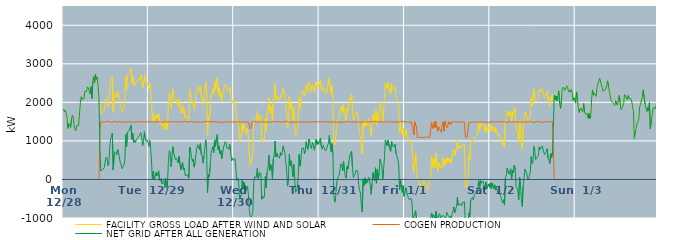
| Category | FACILITY GROSS LOAD AFTER WIND AND SOLAR | COGEN PRODUCTION | NET GRID AFTER ALL GENERATION |
|---|---|---|---|
|  Mon  12/28 | 1824 | 0 | 1824 |
|  Mon  12/28 | 1762 | 0 | 1762 |
|  Mon  12/28 | 1803 | 0 | 1803 |
|  Mon  12/28 | 1714 | 0 | 1714 |
|  Mon  12/28 | 1609 | 0 | 1609 |
|  Mon  12/28 | 1324 | 0 | 1324 |
|  Mon  12/28 | 1448 | 0 | 1448 |
|  Mon  12/28 | 1418 | 0 | 1418 |
|  Mon  12/28 | 1351 | 0 | 1351 |
|  Mon  12/28 | 1542 | 0 | 1542 |
|  Mon  12/28 | 1669 | 0 | 1669 |
|  Mon  12/28 | 1625 | 0 | 1625 |
|  Mon  12/28 | 1381 | 0 | 1381 |
|  Mon  12/28 | 1300 | 0 | 1300 |
|  Mon  12/28 | 1261 | 0 | 1261 |
|  Mon  12/28 | 1401 | 0 | 1401 |
|  Mon  12/28 | 1407 | 0 | 1407 |
|  Mon  12/28 | 1395 | 0 | 1395 |
|  Mon  12/28 | 1663 | 0 | 1663 |
|  Mon  12/28 | 1982 | 0 | 1982 |
|  Mon  12/28 | 2145 | 0 | 2145 |
|  Mon  12/28 | 2077 | 0 | 2077 |
|  Mon  12/28 | 2067 | 0 | 2067 |
|  Mon  12/28 | 2094 | 0 | 2094 |
|  Mon  12/28 | 2285 | 0 | 2285 |
|  Mon  12/28 | 2299 | 0 | 2299 |
|  Mon  12/28 | 2285 | 0 | 2285 |
|  Mon  12/28 | 2402 | 0 | 2402 |
|  Mon  12/28 | 2374 | 0 | 2374 |
|  Mon  12/28 | 2353 | 0 | 2353 |
|  Mon  12/28 | 2224 | 0 | 2224 |
|  Mon  12/28 | 2405 | 0 | 2405 |
|  Mon  12/28 | 2101 | 0 | 2101 |
|  Mon  12/28 | 2532 | 0 | 2532 |
|  Mon  12/28 | 2665 | 0 | 2665 |
|  Mon  12/28 | 2505 | 0 | 2505 |
|  Mon  12/28 | 2722 | 0 | 2722 |
|  Mon  12/28 | 2598 | 0 | 2598 |
|  Mon  12/28 | 2647 | 0 | 2647 |
|  Mon  12/28 | 2416 | 0 | 2416 |
|  Mon  12/28 | 2116 | 0 | 2116 |
|  Mon  12/28 | 2050 | 1239 | 811 |
|  Mon  12/28 | 1715 | 1495 | 220 |
|  Mon  12/28 | 1727 | 1495 | 232 |
|  Mon  12/28 | 1740 | 1489 | 251 |
|  Mon  12/28 | 1734 | 1494 | 240 |
|  Mon  12/28 | 1800 | 1488 | 312 |
|  Mon  12/28 | 1966 | 1487 | 479 |
|  Mon  12/28 | 2085 | 1500 | 585 |
|  Mon  12/28 | 2033 | 1498 | 535 |
|  Mon  12/28 | 1870 | 1507 | 363 |
|  Mon  12/28 | 1921 | 1501 | 420 |
|  Mon  12/28 | 2278 | 1493 | 785 |
|  Mon  12/28 | 2534 | 1489 | 1045 |
|  Mon  12/28 | 2602 | 1478 | 1124 |
|  Mon  12/28 | 2685 | 1486 | 1199 |
|  Mon  12/28 | 1736 | 1488 | 248 |
|  Mon  12/28 | 2131 | 1494 | 637 |
|  Mon  12/28 | 2230 | 1510 | 720 |
|  Mon  12/28 | 2182 | 1494 | 688 |
|  Mon  12/28 | 2119 | 1479 | 640 |
|  Mon  12/28 | 2277 | 1499 | 778 |
|  Mon  12/28 | 2191 | 1500 | 691 |
|  Mon  12/28 | 2165 | 1493 | 672 |
|  Mon  12/28 | 1934 | 1501 | 433 |
|  Mon  12/28 | 1851 | 1489 | 362 |
|  Mon  12/28 | 1764 | 1485 | 279 |
|  Mon  12/28 | 1799 | 1503 | 296 |
|  Mon  12/28 | 1867 | 1490 | 377 |
|  Mon  12/28 | 1979 | 1491 | 488 |
|  Mon  12/28 | 2654 | 1489 | 1165 |
|  Mon  12/28 | 2328 | 1479 | 849 |
|  Mon  12/28 | 2715 | 1493 | 1222 |
|  Mon  12/28 | 2695 | 1490 | 1205 |
|  Mon  12/28 | 2775 | 1498 | 1277 |
|  Mon  12/28 | 2755 | 1490 | 1265 |
|  Mon  12/28 | 2893 | 1487 | 1406 |
|  Mon  12/28 | 2520 | 1480 | 1040 |
|  Mon  12/28 | 2679 | 1482 | 1197 |
|  Mon  12/28 | 2454 | 1497 | 957 |
|  Mon  12/28 | 2513 | 1491 | 1022 |
|  Mon  12/28 | 2446 | 1485 | 961 |
|  Mon  12/28 | 2547 | 1499 | 1048 |
|  Mon  12/28 | 2536 | 1507 | 1029 |
|  Mon  12/28 | 2585 | 1494 | 1091 |
|  Mon  12/28 | 2631 | 1504 | 1127 |
|  Mon  12/28 | 2602 | 1493 | 1109 |
|  Mon  12/28 | 2717 | 1505 | 1212 |
|  Mon  12/28 | 2593 | 1493 | 1100 |
|  Mon  12/28 | 2373 | 1496 | 877 |
|  Mon  12/28 | 2469 | 1492 | 977 |
|  Mon  12/28 | 2725 | 1484 | 1241 |
|  Mon  12/28 | 2548 | 1491 | 1057 |
|  Mon  12/28 | 2485 | 1496 | 989 |
|  Mon  12/28 | 2523 | 1493 | 1030 |
|  Mon  12/28 | 2456 | 1494 | 962 |
|  Tue  12/29 | 2356 | 1495 | 861 |
|  Tue  12/29 | 2505 | 1492 | 1013 |
|  Tue  12/29 | 2301 | 1495 | 806 |
|  Tue  12/29 | 2008 | 1502 | 506 |
|  Tue  12/29 | 1506 | 1499 | 7 |
|  Tue  12/29 | 1715 | 1505 | 210 |
|  Tue  12/29 | 1493 | 1490 | 3 |
|  Tue  12/29 | 1558 | 1493 | 65 |
|  Tue  12/29 | 1677 | 1495 | 182 |
|  Tue  12/29 | 1588 | 1496 | 92 |
|  Tue  12/29 | 1648 | 1503 | 145 |
|  Tue  12/29 | 1710 | 1485 | 225 |
|  Tue  12/29 | 1479 | 1490 | -11 |
|  Tue  12/29 | 1442 | 1485 | -43 |
|  Tue  12/29 | 1508 | 1486 | 22 |
|  Tue  12/29 | 1374 | 1488 | -114 |
|  Tue  12/29 | 1354 | 1487 | -133 |
|  Tue  12/29 | 1459 | 1485 | -26 |
|  Tue  12/29 | 1287 | 1492 | -205 |
|  Tue  12/29 | 1514 | 1490 | 24 |
|  Tue  12/29 | 1281 | 1498 | -217 |
|  Tue  12/29 | 1376 | 1497 | -121 |
|  Tue  12/29 | 1939 | 1489 | 450 |
|  Tue  12/29 | 2246 | 1499 | 747 |
|  Tue  12/29 | 2210 | 1500 | 710 |
|  Tue  12/29 | 1829 | 1496 | 333 |
|  Tue  12/29 | 2035 | 1490 | 545 |
|  Tue  12/29 | 2351 | 1499 | 852 |
|  Tue  12/29 | 2173 | 1497 | 676 |
|  Tue  12/29 | 2094 | 1488 | 606 |
|  Tue  12/29 | 2009 | 1496 | 513 |
|  Tue  12/29 | 2058 | 1502 | 556 |
|  Tue  12/29 | 2063 | 1489 | 574 |
|  Tue  12/29 | 1918 | 1486 | 432 |
|  Tue  12/29 | 2093 | 1493 | 600 |
|  Tue  12/29 | 2107 | 1493 | 614 |
|  Tue  12/29 | 1749 | 1496 | 253 |
|  Tue  12/29 | 1714 | 1486 | 228 |
|  Tue  12/29 | 1926 | 1492 | 434 |
|  Tue  12/29 | 1734 | 1490 | 244 |
|  Tue  12/29 | 1799 | 1502 | 297 |
|  Tue  12/29 | 1593 | 1493 | 100 |
|  Tue  12/29 | 1584 | 1498 | 86 |
|  Tue  12/29 | 1616 | 1492 | 124 |
|  Tue  12/29 | 1561 | 1481 | 80 |
|  Tue  12/29 | 1531 | 1498 | 33 |
|  Tue  12/29 | 2338 | 1501 | 837 |
|  Tue  12/29 | 2234 | 1480 | 754 |
|  Tue  12/29 | 2085 | 1500 | 585 |
|  Tue  12/29 | 1968 | 1502 | 466 |
|  Tue  12/29 | 2018 | 1486 | 532 |
|  Tue  12/29 | 1810 | 1489 | 321 |
|  Tue  12/29 | 1917 | 1490 | 427 |
|  Tue  12/29 | 2161 | 1498 | 663 |
|  Tue  12/29 | 2298 | 1486 | 812 |
|  Tue  12/29 | 2401 | 1501 | 900 |
|  Tue  12/29 | 2377 | 1494 | 883 |
|  Tue  12/29 | 2275 | 1501 | 774 |
|  Tue  12/29 | 2412 | 1484 | 928 |
|  Tue  12/29 | 2162 | 1503 | 659 |
|  Tue  12/29 | 2090 | 1485 | 605 |
|  Tue  12/29 | 1931 | 1507 | 424 |
|  Tue  12/29 | 2103 | 1497 | 606 |
|  Tue  12/29 | 2289 | 1476 | 813 |
|  Tue  12/29 | 2526 | 1500 | 1026 |
|  Tue  12/29 | 2268 | 1495 | 773 |
|  Tue  12/29 | 1152 | 1500 | -348 |
|  Tue  12/29 | 1625 | 1495 | 130 |
|  Tue  12/29 | 1563 | 1497 | 66 |
|  Tue  12/29 | 1801 | 1476 | 325 |
|  Tue  12/29 | 2179 | 1504 | 675 |
|  Tue  12/29 | 2251 | 1481 | 770 |
|  Tue  12/29 | 2345 | 1497 | 848 |
|  Tue  12/29 | 2207 | 1509 | 698 |
|  Tue  12/29 | 2517 | 1496 | 1021 |
|  Tue  12/29 | 2340 | 1494 | 846 |
|  Tue  12/29 | 2561 | 1492 | 1069 |
|  Tue  12/29 | 2656 | 1490 | 1166 |
|  Tue  12/29 | 2255 | 1489 | 766 |
|  Tue  12/29 | 2367 | 1497 | 870 |
|  Tue  12/29 | 2151 | 1486 | 665 |
|  Tue  12/29 | 2259 | 1496 | 763 |
|  Tue  12/29 | 2024 | 1481 | 543 |
|  Tue  12/29 | 2193 | 1492 | 701 |
|  Tue  12/29 | 2289 | 1477 | 812 |
|  Tue  12/29 | 2422 | 1501 | 921 |
|  Tue  12/29 | 2477 | 1498 | 979 |
|  Tue  12/29 | 2416 | 1491 | 925 |
|  Tue  12/29 | 2311 | 1501 | 810 |
|  Tue  12/29 | 2306 | 1485 | 821 |
|  Tue  12/29 | 2271 | 1484 | 787 |
|  Tue  12/29 | 2396 | 1486 | 910 |
|  Tue  12/29 | 2215 | 1494 | 721 |
|  Tue  12/29 | 1995 | 1508 | 487 |
|  Tue  12/29 | 2048 | 1489 | 559 |
|  Tue  12/29 | 1980 | 1483 | 497 |
|  Wed  12/30 | 1994 | 1497 | 497 |
|  Wed  12/30 | 2037 | 1496 | 541 |
|  Wed  12/30 | 1736 | 1487 | 249 |
|  Wed  12/30 | 1461 | 1488 | -27 |
|  Wed  12/30 | 1525 | 1494 | 31 |
|  Wed  12/30 | 1466 | 1509 | -43 |
|  Wed  12/30 | 993 | 1493 | -500 |
|  Wed  12/30 | 995 | 1485 | -490 |
|  Wed  12/30 | 1085 | 1487 | -402 |
|  Wed  12/30 | 1493 | 1492 | 1 |
|  Wed  12/30 | 1255 | 1491 | -236 |
|  Wed  12/30 | 1422 | 1489 | -67 |
|  Wed  12/30 | 1316 | 1495 | -179 |
|  Wed  12/30 | 1186 | 1496 | -310 |
|  Wed  12/30 | 1287 | 1490 | -203 |
|  Wed  12/30 | 1325 | 1494 | -169 |
|  Wed  12/30 | 1093 | 1488 | -395 |
|  Wed  12/30 | 703 | 1491 | -788 |
|  Wed  12/30 | 365 | 1310 | -945 |
|  Wed  12/30 | 368 | 1342 | -974 |
|  Wed  12/30 | 557 | 1491 | -934 |
|  Wed  12/30 | 660 | 1494 | -834 |
|  Wed  12/30 | 1425 | 1505 | -80 |
|  Wed  12/30 | 1559 | 1489 | 70 |
|  Wed  12/30 | 1569 | 1494 | 75 |
|  Wed  12/30 | 1563 | 1502 | 61 |
|  Wed  12/30 | 1773 | 1486 | 287 |
|  Wed  12/30 | 1519 | 1490 | 29 |
|  Wed  12/30 | 1618 | 1496 | 122 |
|  Wed  12/30 | 1672 | 1490 | 182 |
|  Wed  12/30 | 1639 | 1486 | 153 |
|  Wed  12/30 | 978 | 1493 | -515 |
|  Wed  12/30 | 1070 | 1497 | -427 |
|  Wed  12/30 | 1005 | 1490 | -485 |
|  Wed  12/30 | 1061 | 1494 | -433 |
|  Wed  12/30 | 1577 | 1503 | 74 |
|  Wed  12/30 | 1274 | 1487 | -213 |
|  Wed  12/30 | 1689 | 1497 | 192 |
|  Wed  12/30 | 1777 | 1478 | 299 |
|  Wed  12/30 | 2120 | 1490 | 630 |
|  Wed  12/30 | 1730 | 1496 | 234 |
|  Wed  12/30 | 1887 | 1501 | 386 |
|  Wed  12/30 | 1795 | 1488 | 307 |
|  Wed  12/30 | 1484 | 1483 | 1 |
|  Wed  12/30 | 2040 | 1502 | 538 |
|  Wed  12/30 | 2131 | 1493 | 638 |
|  Wed  12/30 | 2499 | 1504 | 995 |
|  Wed  12/30 | 2073 | 1491 | 582 |
|  Wed  12/30 | 2165 | 1486 | 679 |
|  Wed  12/30 | 2093 | 1492 | 601 |
|  Wed  12/30 | 2109 | 1499 | 610 |
|  Wed  12/30 | 2041 | 1491 | 550 |
|  Wed  12/30 | 2185 | 1488 | 697 |
|  Wed  12/30 | 2122 | 1502 | 620 |
|  Wed  12/30 | 2196 | 1493 | 703 |
|  Wed  12/30 | 2363 | 1496 | 867 |
|  Wed  12/30 | 2266 | 1490 | 776 |
|  Wed  12/30 | 2186 | 1489 | 697 |
|  Wed  12/30 | 1942 | 1503 | 439 |
|  Wed  12/30 | 1737 | 1490 | 247 |
|  Wed  12/30 | 1334 | 1506 | -172 |
|  Wed  12/30 | 1477 | 1475 | 2 |
|  Wed  12/30 | 2153 | 1494 | 659 |
|  Wed  12/30 | 1852 | 1493 | 359 |
|  Wed  12/30 | 1966 | 1482 | 484 |
|  Wed  12/30 | 1783 | 1479 | 304 |
|  Wed  12/30 | 1551 | 1485 | 66 |
|  Wed  12/30 | 1883 | 1492 | 391 |
|  Wed  12/30 | 1524 | 1495 | 29 |
|  Wed  12/30 | 1147 | 1484 | -337 |
|  Wed  12/30 | 1196 | 1507 | -311 |
|  Wed  12/30 | 1273 | 1489 | -216 |
|  Wed  12/30 | 1570 | 1497 | 73 |
|  Wed  12/30 | 2124 | 1475 | 649 |
|  Wed  12/30 | 1836 | 1493 | 343 |
|  Wed  12/30 | 2010 | 1496 | 514 |
|  Wed  12/30 | 2294 | 1485 | 809 |
|  Wed  12/30 | 2292 | 1487 | 805 |
|  Wed  12/30 | 2301 | 1486 | 815 |
|  Wed  12/30 | 2162 | 1499 | 663 |
|  Wed  12/30 | 2246 | 1499 | 747 |
|  Wed  12/30 | 2466 | 1487 | 979 |
|  Wed  12/30 | 2346 | 1502 | 844 |
|  Wed  12/30 | 2268 | 1484 | 784 |
|  Wed  12/30 | 2530 | 1484 | 1046 |
|  Wed  12/30 | 2464 | 1488 | 976 |
|  Wed  12/30 | 2339 | 1493 | 846 |
|  Wed  12/30 | 2285 | 1484 | 801 |
|  Wed  12/30 | 2457 | 1491 | 966 |
|  Wed  12/30 | 2407 | 1492 | 915 |
|  Wed  12/30 | 2259 | 1498 | 761 |
|  Wed  12/30 | 2369 | 1506 | 863 |
|  Wed  12/30 | 2538 | 1495 | 1043 |
|  Wed  12/30 | 2399 | 1492 | 907 |
|  Wed  12/30 | 2472 | 1482 | 990 |
|  Wed  12/30 | 2406 | 1494 | 912 |
|  Thu  12/31 | 2484 | 1490 | 994 |
|  Thu  12/31 | 2574 | 1498 | 1076 |
|  Thu  12/31 | 2350 | 1495 | 855 |
|  Thu  12/31 | 2288 | 1503 | 785 |
|  Thu  12/31 | 2371 | 1486 | 885 |
|  Thu  12/31 | 2397 | 1490 | 907 |
|  Thu  12/31 | 2276 | 1498 | 778 |
|  Thu  12/31 | 2227 | 1489 | 738 |
|  Thu  12/31 | 2276 | 1482 | 794 |
|  Thu  12/31 | 2391 | 1494 | 897 |
|  Thu  12/31 | 2412 | 1487 | 925 |
|  Thu  12/31 | 2635 | 1493 | 1142 |
|  Thu  12/31 | 2397 | 1506 | 891 |
|  Thu  12/31 | 2212 | 1493 | 719 |
|  Thu  12/31 | 2432 | 1502 | 930 |
|  Thu  12/31 | 2164 | 1489 | 675 |
|  Thu  12/31 | 1087 | 1493 | -406 |
|  Thu  12/31 | 901 | 1494 | -593 |
|  Thu  12/31 | 1009 | 1494 | -485 |
|  Thu  12/31 | 1302 | 1485 | -183 |
|  Thu  12/31 | 1512 | 1495 | 17 |
|  Thu  12/31 | 1556 | 1488 | 68 |
|  Thu  12/31 | 1599 | 1487 | 112 |
|  Thu  12/31 | 1747 | 1488 | 259 |
|  Thu  12/31 | 1903 | 1496 | 407 |
|  Thu  12/31 | 1836 | 1484 | 352 |
|  Thu  12/31 | 1725 | 1498 | 227 |
|  Thu  12/31 | 1956 | 1481 | 475 |
|  Thu  12/31 | 1707 | 1494 | 213 |
|  Thu  12/31 | 1603 | 1503 | 100 |
|  Thu  12/31 | 1516 | 1482 | 34 |
|  Thu  12/31 | 1838 | 1502 | 336 |
|  Thu  12/31 | 1778 | 1502 | 276 |
|  Thu  12/31 | 1966 | 1497 | 469 |
|  Thu  12/31 | 2121 | 1504 | 617 |
|  Thu  12/31 | 2086 | 1484 | 602 |
|  Thu  12/31 | 2215 | 1486 | 729 |
|  Thu  12/31 | 1818 | 1489 | 329 |
|  Thu  12/31 | 1545 | 1494 | 51 |
|  Thu  12/31 | 1594 | 1497 | 97 |
|  Thu  12/31 | 1629 | 1492 | 137 |
|  Thu  12/31 | 1713 | 1483 | 230 |
|  Thu  12/31 | 1759 | 1505 | 254 |
|  Thu  12/31 | 1729 | 1507 | 222 |
|  Thu  12/31 | 1357 | 1487 | -130 |
|  Thu  12/31 | 1195 | 1480 | -285 |
|  Thu  12/31 | 1136 | 1486 | -350 |
|  Thu  12/31 | 831 | 1486 | -655 |
|  Thu  12/31 | 658 | 1501 | -843 |
|  Thu  12/31 | 1465 | 1481 | -16 |
|  Thu  12/31 | 1351 | 1512 | -161 |
|  Thu  12/31 | 1536 | 1494 | 42 |
|  Thu  12/31 | 1378 | 1489 | -111 |
|  Thu  12/31 | 1476 | 1490 | -14 |
|  Thu  12/31 | 1418 | 1492 | -74 |
|  Thu  12/31 | 1573 | 1510 | 63 |
|  Thu  12/31 | 1500 | 1495 | 5 |
|  Thu  12/31 | 1353 | 1507 | -154 |
|  Thu  12/31 | 1120 | 1504 | -384 |
|  Thu  12/31 | 1377 | 1502 | -125 |
|  Thu  12/31 | 1669 | 1490 | 179 |
|  Thu  12/31 | 1542 | 1505 | 37 |
|  Thu  12/31 | 1479 | 1508 | -29 |
|  Thu  12/31 | 1796 | 1493 | 303 |
|  Thu  12/31 | 1407 | 1505 | -98 |
|  Thu  12/31 | 1762 | 1493 | 269 |
|  Thu  12/31 | 1499 | 1493 | 6 |
|  Thu  12/31 | 1671 | 1498 | 173 |
|  Thu  12/31 | 2024 | 1501 | 523 |
|  Thu  12/31 | 1923 | 1494 | 429 |
|  Thu  12/31 | 1861 | 1487 | 374 |
|  Thu  12/31 | 1488 | 1500 | -12 |
|  Thu  12/31 | 1749 | 1488 | 261 |
|  Thu  12/31 | 2073 | 1514 | 559 |
|  Thu  12/31 | 2512 | 1496 | 1016 |
|  Thu  12/31 | 2430 | 1480 | 950 |
|  Thu  12/31 | 2370 | 1500 | 870 |
|  Thu  12/31 | 2515 | 1501 | 1014 |
|  Thu  12/31 | 2512 | 1500 | 1012 |
|  Thu  12/31 | 2272 | 1484 | 788 |
|  Thu  12/31 | 2208 | 1478 | 730 |
|  Thu  12/31 | 2487 | 1502 | 985 |
|  Thu  12/31 | 2368 | 1495 | 873 |
|  Thu  12/31 | 2337 | 1488 | 849 |
|  Thu  12/31 | 2334 | 1487 | 847 |
|  Thu  12/31 | 2404 | 1489 | 915 |
|  Thu  12/31 | 2167 | 1502 | 665 |
|  Thu  12/31 | 2110 | 1492 | 618 |
|  Thu  12/31 | 2010 | 1494 | 516 |
|  Thu  12/31 | 1875 | 1490 | 385 |
|  Thu  12/31 | 1221 | 1489 | -268 |
|  Thu  12/31 | 1505 | 1500 | 5 |
|  Thu  12/31 | 1272 | 1480 | -208 |
|  Thu  12/31 | 1164 | 1499 | -335 |
|  Thu  12/31 | 1326 | 1485 | -159 |
|  Thu  12/31 | 1065 | 1503 | -438 |
|  Fri  1/1 | 1140 | 1498 | -358 |
|  Fri  1/1 | 1283 | 1495 | -212 |
|  Fri  1/1 | 1177 | 1499 | -322 |
|  Fri  1/1 | 1073 | 1485 | -412 |
|  Fri  1/1 | 1012 | 1492 | -480 |
|  Fri  1/1 | 967 | 1491 | -524 |
|  Fri  1/1 | 957 | 1489 | -532 |
|  Fri  1/1 | 1009 | 1499 | -490 |
|  Fri  1/1 | 890 | 1500 | -610 |
|  Fri  1/1 | 275 | 1332 | -1057 |
|  Fri  1/1 | 184 | 1163 | -979 |
|  Fri  1/1 | 516 | 1497 | -981 |
|  Fri  1/1 | 675 | 1487 | -812 |
|  Fri  1/1 | 343 | 1365 | -1022 |
|  Fri  1/1 | -12 | 1090 | -1102 |
|  Fri  1/1 | -46 | 1097 | -1143 |
|  Fri  1/1 | -69 | 1091 | -1160 |
|  Fri  1/1 | -51 | 1091 | -1142 |
|  Fri  1/1 | -237 | 1092 | -1329 |
|  Fri  1/1 | -246 | 1101 | -1347 |
|  Fri  1/1 | -139 | 1090 | -1229 |
|  Fri  1/1 | -32 | 1092 | -1124 |
|  Fri  1/1 | -107 | 1091 | -1198 |
|  Fri  1/1 | -125 | 1095 | -1220 |
|  Fri  1/1 | -109 | 1100 | -1209 |
|  Fri  1/1 | -275 | 1098 | -1373 |
|  Fri  1/1 | -214 | 1100 | -1314 |
|  Fri  1/1 | -152 | 1094 | -1246 |
|  Fri  1/1 | 13 | 1091 | -1078 |
|  Fri  1/1 | 114 | 1105 | -991 |
|  Fri  1/1 | 616 | 1485 | -869 |
|  Fri  1/1 | 310 | 1315 | -1005 |
|  Fri  1/1 | 446 | 1360 | -914 |
|  Fri  1/1 | 550 | 1496 | -946 |
|  Fri  1/1 | 309 | 1342 | -1033 |
|  Fri  1/1 | 680 | 1501 | -821 |
|  Fri  1/1 | 334 | 1338 | -1004 |
|  Fri  1/1 | 204 | 1251 | -1047 |
|  Fri  1/1 | 442 | 1367 | -925 |
|  Fri  1/1 | 434 | 1319 | -885 |
|  Fri  1/1 | 313 | 1314 | -1001 |
|  Fri  1/1 | 285 | 1225 | -940 |
|  Fri  1/1 | 454 | 1425 | -971 |
|  Fri  1/1 | 560 | 1493 | -933 |
|  Fri  1/1 | 336 | 1253 | -917 |
|  Fri  1/1 | 526 | 1508 | -982 |
|  Fri  1/1 | 394 | 1405 | -1011 |
|  Fri  1/1 | 566 | 1421 | -855 |
|  Fri  1/1 | 463 | 1333 | -870 |
|  Fri  1/1 | 548 | 1498 | -950 |
|  Fri  1/1 | 448 | 1439 | -991 |
|  Fri  1/1 | 536 | 1487 | -951 |
|  Fri  1/1 | 423 | 1421 | -998 |
|  Fri  1/1 | 603 | 1494 | -891 |
|  Fri  1/1 | 675 | 1503 | -828 |
|  Fri  1/1 | 784 | 1497 | -713 |
|  Fri  1/1 | 620 | 1486 | -866 |
|  Fri  1/1 | 707 | 1489 | -782 |
|  Fri  1/1 | 785 | 1489 | -704 |
|  Fri  1/1 | 1022 | 1485 | -463 |
|  Fri  1/1 | 801 | 1479 | -678 |
|  Fri  1/1 | 833 | 1490 | -657 |
|  Fri  1/1 | 867 | 1494 | -627 |
|  Fri  1/1 | 861 | 1485 | -624 |
|  Fri  1/1 | 797 | 1483 | -686 |
|  Fri  1/1 | 912 | 1495 | -583 |
|  Fri  1/1 | 896 | 1507 | -611 |
|  Fri  1/1 | 905 | 1482 | -577 |
|  Fri  1/1 | -193 | 1092 | -1285 |
|  Fri  1/1 | -228 | 1103 | -1331 |
|  Fri  1/1 | -249 | 1098 | -1347 |
|  Fri  1/1 | -45 | 1087 | -1132 |
|  Fri  1/1 | 622 | 1488 | -866 |
|  Fri  1/1 | 514 | 1487 | -973 |
|  Fri  1/1 | 964 | 1483 | -519 |
|  Fri  1/1 | 987 | 1504 | -517 |
|  Fri  1/1 | 1024 | 1494 | -470 |
|  Fri  1/1 | 959 | 1491 | -532 |
|  Fri  1/1 | 1077 | 1485 | -408 |
|  Fri  1/1 | 1127 | 1497 | -370 |
|  Fri  1/1 | 1148 | 1497 | -349 |
|  Fri  1/1 | 1136 | 1485 | -349 |
|  Fri  1/1 | 1264 | 1475 | -211 |
|  Fri  1/1 | 1460 | 1491 | -31 |
|  Fri  1/1 | 1249 | 1493 | -244 |
|  Fri  1/1 | 1462 | 1489 | -27 |
|  Fri  1/1 | 1407 | 1497 | -90 |
|  Fri  1/1 | 1396 | 1489 | -93 |
|  Fri  1/1 | 1432 | 1481 | -49 |
|  Fri  1/1 | 1333 | 1489 | -156 |
|  Fri  1/1 | 1221 | 1493 | -272 |
|  Fri  1/1 | 1436 | 1502 | -66 |
|  Fri  1/1 | 1250 | 1487 | -237 |
|  Fri  1/1 | 1231 | 1482 | -251 |
|  Fri  1/1 | 1356 | 1477 | -121 |
|  Fri  1/1 | 1297 | 1498 | -201 |
|  Sat  1/2 | 1403 | 1494 | -91 |
|  Sat  1/2 | 1260 | 1494 | -234 |
|  Sat  1/2 | 1406 | 1495 | -89 |
|  Sat  1/2 | 1390 | 1497 | -107 |
|  Sat  1/2 | 1246 | 1491 | -245 |
|  Sat  1/2 | 1347 | 1485 | -138 |
|  Sat  1/2 | 1222 | 1500 | -278 |
|  Sat  1/2 | 1288 | 1495 | -207 |
|  Sat  1/2 | 1292 | 1497 | -205 |
|  Sat  1/2 | 1120 | 1495 | -375 |
|  Sat  1/2 | 1181 | 1497 | -316 |
|  Sat  1/2 | 1188 | 1496 | -308 |
|  Sat  1/2 | 1036 | 1493 | -457 |
|  Sat  1/2 | 933 | 1491 | -558 |
|  Sat  1/2 | 890 | 1492 | -602 |
|  Sat  1/2 | 978 | 1503 | -525 |
|  Sat  1/2 | 828 | 1493 | -665 |
|  Sat  1/2 | 1531 | 1497 | 34 |
|  Sat  1/2 | 1599 | 1485 | 114 |
|  Sat  1/2 | 1781 | 1486 | 295 |
|  Sat  1/2 | 1765 | 1487 | 278 |
|  Sat  1/2 | 1637 | 1497 | 140 |
|  Sat  1/2 | 1712 | 1517 | 195 |
|  Sat  1/2 | 1779 | 1504 | 275 |
|  Sat  1/2 | 1498 | 1482 | 16 |
|  Sat  1/2 | 1733 | 1500 | 233 |
|  Sat  1/2 | 1668 | 1493 | 175 |
|  Sat  1/2 | 1858 | 1492 | 366 |
|  Sat  1/2 | 1784 | 1499 | 285 |
|  Sat  1/2 | 1316 | 1490 | -174 |
|  Sat  1/2 | 1270 | 1490 | -220 |
|  Sat  1/2 | 1189 | 1501 | -312 |
|  Sat  1/2 | 960 | 1495 | -535 |
|  Sat  1/2 | 1536 | 1479 | 57 |
|  Sat  1/2 | 1363 | 1490 | -127 |
|  Sat  1/2 | 967 | 1493 | -526 |
|  Sat  1/2 | 791 | 1493 | -702 |
|  Sat  1/2 | 1331 | 1501 | -170 |
|  Sat  1/2 | 1516 | 1483 | 33 |
|  Sat  1/2 | 1764 | 1496 | 268 |
|  Sat  1/2 | 1721 | 1505 | 216 |
|  Sat  1/2 | 1647 | 1498 | 149 |
|  Sat  1/2 | 1518 | 1492 | 26 |
|  Sat  1/2 | 1478 | 1480 | -2 |
|  Sat  1/2 | 1475 | 1500 | -25 |
|  Sat  1/2 | 1688 | 1503 | 185 |
|  Sat  1/2 | 2098 | 1507 | 591 |
|  Sat  1/2 | 1907 | 1497 | 410 |
|  Sat  1/2 | 1931 | 1471 | 460 |
|  Sat  1/2 | 2350 | 1496 | 854 |
|  Sat  1/2 | 2260 | 1491 | 769 |
|  Sat  1/2 | 2008 | 1494 | 514 |
|  Sat  1/2 | 1991 | 1497 | 494 |
|  Sat  1/2 | 2080 | 1488 | 592 |
|  Sat  1/2 | 2125 | 1503 | 622 |
|  Sat  1/2 | 2336 | 1491 | 845 |
|  Sat  1/2 | 2267 | 1498 | 769 |
|  Sat  1/2 | 2270 | 1485 | 785 |
|  Sat  1/2 | 2355 | 1484 | 871 |
|  Sat  1/2 | 2311 | 1494 | 817 |
|  Sat  1/2 | 2317 | 1484 | 833 |
|  Sat  1/2 | 2131 | 1491 | 640 |
|  Sat  1/2 | 2182 | 1499 | 683 |
|  Sat  1/2 | 2211 | 1487 | 724 |
|  Sat  1/2 | 2293 | 1496 | 797 |
|  Sat  1/2 | 2057 | 1500 | 557 |
|  Sat  1/2 | 1992 | 1498 | 494 |
|  Sat  1/2 | 1898 | 1487 | 411 |
|  Sat  1/2 | 2165 | 1492 | 673 |
|  Sat  1/2 | 2057 | 1495 | 562 |
|  Sat  1/2 | 2204 | 1495 | 709 |
|  Sat  1/2 | 2191 | 1494 | 697 |
|  Sat  1/2 | 2186 | 0 | 2186 |
|  Sat  1/2 | 2072 | 0 | 2072 |
|  Sat  1/2 | 2165 | 0 | 2165 |
|  Sat  1/2 | 2036 | 0 | 2036 |
|  Sat  1/2 | 2156 | 0 | 2156 |
|  Sat  1/2 | 2298 | 0 | 2298 |
|  Sat  1/2 | 1974 | 0 | 1974 |
|  Sat  1/2 | 1840 | 0 | 1840 |
|  Sat  1/2 | 2031 | 0 | 2031 |
|  Sat  1/2 | 2363 | 0 | 2363 |
|  Sat  1/2 | 2393 | 0 | 2393 |
|  Sat  1/2 | 2353 | 0 | 2353 |
|  Sat  1/2 | 2310 | 0 | 2310 |
|  Sat  1/2 | 2319 | 0 | 2319 |
|  Sat  1/2 | 2429 | 0 | 2429 |
|  Sat  1/2 | 2385 | 0 | 2385 |
|  Sat  1/2 | 2281 | 0 | 2281 |
|  Sat  1/2 | 2316 | 0 | 2316 |
|  Sat  1/2 | 2258 | 0 | 2258 |
|  Sat  1/2 | 2335 | 0 | 2335 |
|  Sat  1/2 | 2285 | 0 | 2285 |
|  Sat  1/2 | 2051 | 0 | 2051 |
|  Sat  1/2 | 2124 | 0 | 2124 |
|  Sat  1/2 | 2113 | 0 | 2113 |
|  Sun  1/3 | 1981 | 0 | 1981 |
|  Sun  1/3 | 2271 | 0 | 2271 |
|  Sun  1/3 | 2133 | 0 | 2133 |
|  Sun  1/3 | 1863 | 0 | 1863 |
|  Sun  1/3 | 1737 | 0 | 1737 |
|  Sun  1/3 | 1824 | 0 | 1824 |
|  Sun  1/3 | 1850 | 0 | 1850 |
|  Sun  1/3 | 1851 | 0 | 1851 |
|  Sun  1/3 | 1748 | 0 | 1748 |
|  Sun  1/3 | 1969 | 0 | 1969 |
|  Sun  1/3 | 1756 | 0 | 1756 |
|  Sun  1/3 | 1691 | 0 | 1691 |
|  Sun  1/3 | 1725 | 0 | 1725 |
|  Sun  1/3 | 1691 | 0 | 1691 |
|  Sun  1/3 | 1588 | 0 | 1588 |
|  Sun  1/3 | 1714 | 0 | 1714 |
|  Sun  1/3 | 1580 | 0 | 1580 |
|  Sun  1/3 | 1644 | 0 | 1644 |
|  Sun  1/3 | 2108 | 0 | 2108 |
|  Sun  1/3 | 2323 | 0 | 2323 |
|  Sun  1/3 | 2186 | 0 | 2186 |
|  Sun  1/3 | 2241 | 0 | 2241 |
|  Sun  1/3 | 2246 | 0 | 2246 |
|  Sun  1/3 | 2153 | 0 | 2153 |
|  Sun  1/3 | 2386 | 0 | 2386 |
|  Sun  1/3 | 2481 | 0 | 2481 |
|  Sun  1/3 | 2475 | 0 | 2475 |
|  Sun  1/3 | 2627 | 0 | 2627 |
|  Sun  1/3 | 2650 | 0 | 2650 |
|  Sun  1/3 | 2451 | 0 | 2451 |
|  Sun  1/3 | 2381 | 0 | 2381 |
|  Sun  1/3 | 2277 | 0 | 2277 |
|  Sun  1/3 | 2313 | 0 | 2313 |
|  Sun  1/3 | 2332 | 0 | 2332 |
|  Sun  1/3 | 2343 | 0 | 2343 |
|  Sun  1/3 | 2347 | 0 | 2347 |
|  Sun  1/3 | 2558 | 0 | 2558 |
|  Sun  1/3 | 2417 | 0 | 2417 |
|  Sun  1/3 | 2264 | 0 | 2264 |
|  Sun  1/3 | 2249 | 0 | 2249 |
|  Sun  1/3 | 2034 | 0 | 2034 |
|  Sun  1/3 | 2039 | 0 | 2039 |
|  Sun  1/3 | 1991 | 0 | 1991 |
|  Sun  1/3 | 1962 | 0 | 1962 |
|  Sun  1/3 | 1920 | 0 | 1920 |
|  Sun  1/3 | 2041 | 0 | 2041 |
|  Sun  1/3 | 1956 | 0 | 1956 |
|  Sun  1/3 | 1925 | 0 | 1925 |
|  Sun  1/3 | 1918 | 0 | 1918 |
|  Sun  1/3 | 2180 | 0 | 2180 |
|  Sun  1/3 | 1995 | 0 | 1995 |
|  Sun  1/3 | 1802 | 0 | 1802 |
|  Sun  1/3 | 1842 | 0 | 1842 |
|  Sun  1/3 | 1900 | 0 | 1900 |
|  Sun  1/3 | 1967 | 0 | 1967 |
|  Sun  1/3 | 2202 | 0 | 2202 |
|  Sun  1/3 | 2169 | 0 | 2169 |
|  Sun  1/3 | 2182 | 0 | 2182 |
|  Sun  1/3 | 2069 | 0 | 2069 |
|  Sun  1/3 | 2176 | 0 | 2176 |
|  Sun  1/3 | 2099 | 0 | 2099 |
|  Sun  1/3 | 2099 | 0 | 2099 |
|  Sun  1/3 | 2097 | 0 | 2097 |
|  Sun  1/3 | 2036 | 0 | 2036 |
|  Sun  1/3 | 1891 | 0 | 1891 |
|  Sun  1/3 | 1765 | 0 | 1765 |
|  Sun  1/3 | 1066 | 0 | 1066 |
|  Sun  1/3 | 1233 | 0 | 1233 |
|  Sun  1/3 | 1319 | 0 | 1319 |
|  Sun  1/3 | 1464 | 0 | 1464 |
|  Sun  1/3 | 1499 | 0 | 1499 |
|  Sun  1/3 | 1569 | 0 | 1569 |
|  Sun  1/3 | 1881 | 0 | 1881 |
|  Sun  1/3 | 1943 | 0 | 1943 |
|  Sun  1/3 | 1938 | 0 | 1938 |
|  Sun  1/3 | 2146 | 0 | 2146 |
|  Sun  1/3 | 2327 | 0 | 2327 |
|  Sun  1/3 | 2329 | 0 | 2329 |
|  Sun  1/3 | 1957 | 0 | 1957 |
|  Sun  1/3 | 1964 | 0 | 1964 |
|  Sun  1/3 | 1764 | 0 | 1764 |
|  Sun  1/3 | 1864 | 0 | 1864 |
|  Sun  1/3 | 1778 | 0 | 1778 |
|  Sun  1/3 | 1993 | 0 | 1993 |
|  Sun  1/3 | 1310 | 0 | 1310 |
|  Sun  1/3 | 1512 | 0 | 1512 |
|  Sun  1/3 | 1639 | 0 | 1639 |
|  Sun  1/3 | 1824 | 0 | 1824 |
|  Sun  1/3 | 1877 | 0 | 1877 |
|  Sun  1/3 | 1872 | 0 | 1872 |
|  Sun  1/3 | 1832 | 0 | 1832 |
|  Sun  1/3 | 2014 | 0 | 2014 |